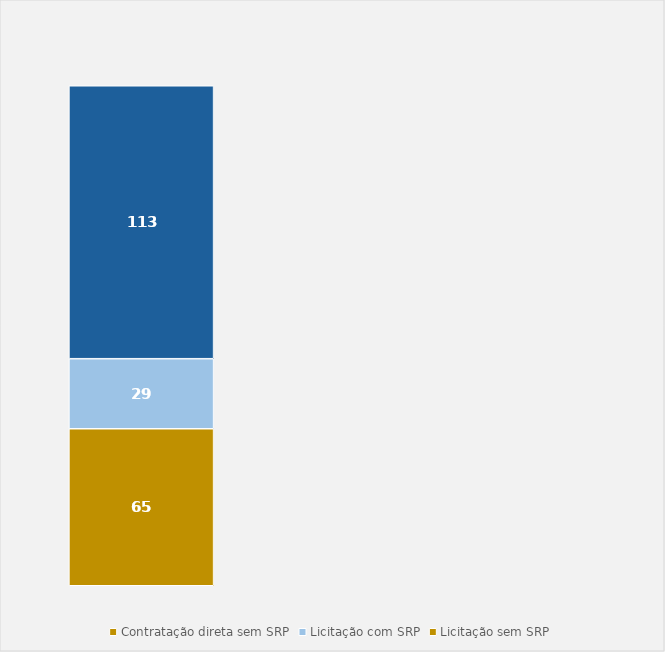
| Category | Contratação direta sem SRP | Licitação com SRP | Licitação sem SRP |
|---|---|---|---|
| Total | 65 | 29 | 113 |